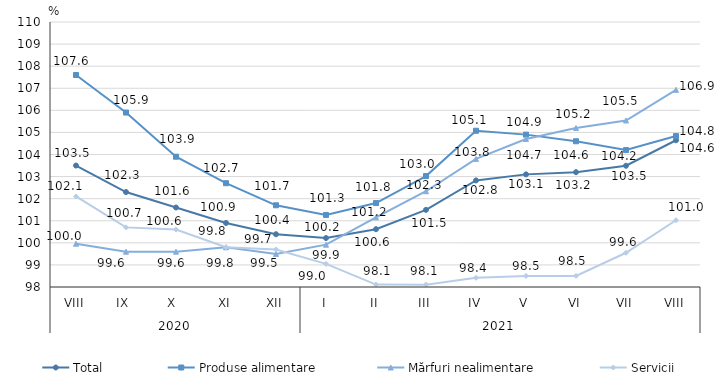
| Category | Total  | Produse alimentare | Mărfuri nealimentare  | Servicii |
|---|---|---|---|---|
| 0 | 103.5 | 107.6 | 99.96 | 102.1 |
| 1 | 102.3 | 105.9 | 99.6 | 100.7 |
| 2 | 101.6 | 103.9 | 99.6 | 100.6 |
| 3 | 100.9 | 102.7 | 99.8 | 99.8 |
| 4 | 100.39 | 101.7 | 99.5 | 99.7 |
| 5 | 100.216 | 101.263 | 99.917 | 99.046 |
| 6 | 100.619 | 101.8 | 101.154 | 98.109 |
| 7 | 101.493 | 103.024 | 102.337 | 98.107 |
| 8 | 102.826 | 105.075 | 103.801 | 98.417 |
| 9 | 103.1 | 104.9 | 104.7 | 98.5 |
| 10 | 103.2 | 104.6 | 105.2 | 98.5 |
| 11 | 103.49 | 104.2 | 105.54 | 99.55 |
| 12 | 104.645 | 104.834 | 106.928 | 101.023 |